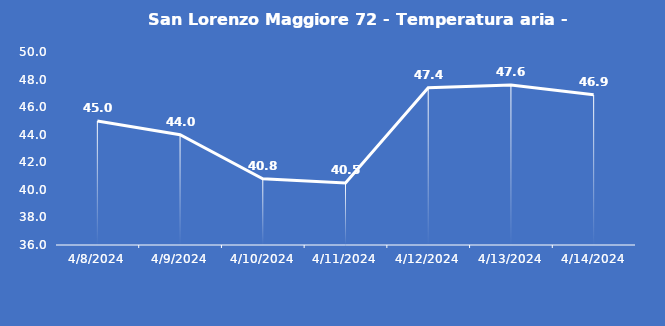
| Category | San Lorenzo Maggiore 72 - Temperatura aria - Grezzo (°C) |
|---|---|
| 4/8/24 | 45 |
| 4/9/24 | 44 |
| 4/10/24 | 40.8 |
| 4/11/24 | 40.5 |
| 4/12/24 | 47.4 |
| 4/13/24 | 47.6 |
| 4/14/24 | 46.9 |